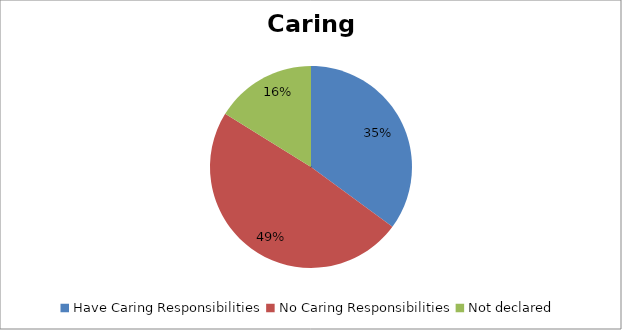
| Category | Total % |
|---|---|
| Have Caring Responsibilities | 0.351 |
| No Caring Responsibilities | 0.487 |
| Not declared | 0.162 |